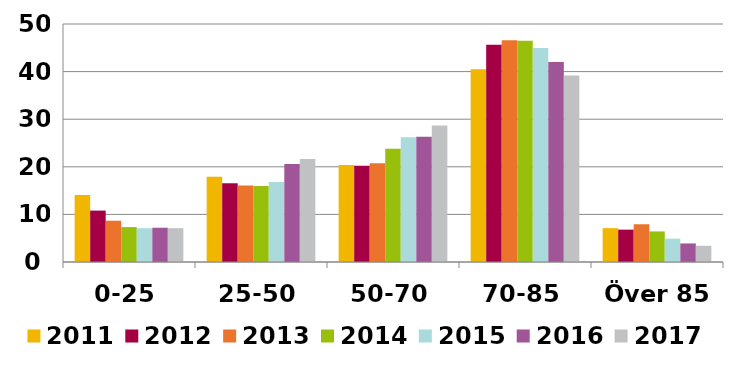
| Category | 2011 | 2012 | 2013 | 2014 | 2015 | 2016 | 2017 |
|---|---|---|---|---|---|---|---|
| 0-25 | 14.07 | 10.8 | 8.67 | 7.34 | 7.09 | 7.2 | 7.11 |
| 25-50 | 17.93 | 16.56 | 16.05 | 15.96 | 16.82 | 20.6 | 21.63 |
| 50-70 | 20.4 | 20.22 | 20.75 | 23.8 | 26.23 | 26.3 | 28.66 |
| 70-85 | 40.49 | 45.63 | 46.6 | 46.49 | 44.96 | 42 | 39.2 |
| Över 85 | 7.11 | 6.8 | 7.93 | 6.42 | 4.9 | 3.9 | 3.41 |